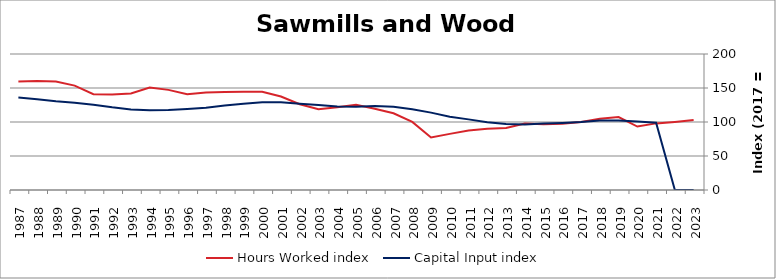
| Category | Hours Worked index | Capital Input index |
|---|---|---|
| 2023.0 | 102.812 | 0 |
| 2022.0 | 100.174 | 0 |
| 2021.0 | 97.967 | 98.872 |
| 2020.0 | 93.354 | 100.659 |
| 2019.0 | 107.268 | 102.319 |
| 2018.0 | 104.91 | 102.194 |
| 2017.0 | 100 | 100 |
| 2016.0 | 97.518 | 98.705 |
| 2015.0 | 96.519 | 97.939 |
| 2014.0 | 97.858 | 96.501 |
| 2013.0 | 91.24 | 97.18 |
| 2012.0 | 90.029 | 99.793 |
| 2011.0 | 87.657 | 103.853 |
| 2010.0 | 82.513 | 107.724 |
| 2009.0 | 77.216 | 113.774 |
| 2008.0 | 100.059 | 118.814 |
| 2007.0 | 112.867 | 122.531 |
| 2006.0 | 119.361 | 123.392 |
| 2005.0 | 125.287 | 122.483 |
| 2004.0 | 121.63 | 122.922 |
| 2003.0 | 118.666 | 124.975 |
| 2002.0 | 126.083 | 126.935 |
| 2001.0 | 137.4 | 129.123 |
| 2000.0 | 144.333 | 129.216 |
| 1999.0 | 144.668 | 126.721 |
| 1998.0 | 144.155 | 124.242 |
| 1997.0 | 143.518 | 120.842 |
| 1996.0 | 140.916 | 119.217 |
| 1995.0 | 147.235 | 117.506 |
| 1994.0 | 150.765 | 117.266 |
| 1993.0 | 142.046 | 118.339 |
| 1992.0 | 140.361 | 121.555 |
| 1991.0 | 140.944 | 125.5 |
| 1990.0 | 153.527 | 128.477 |
| 1989.0 | 159.68 | 130.453 |
| 1988.0 | 160.381 | 133.568 |
| 1987.0 | 159.407 | 136.155 |